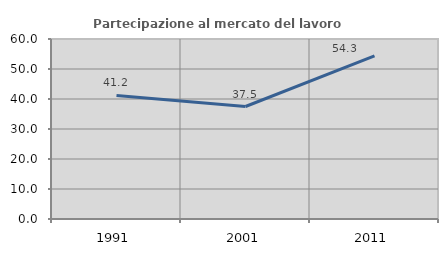
| Category | Partecipazione al mercato del lavoro  femminile |
|---|---|
| 1991.0 | 41.176 |
| 2001.0 | 37.5 |
| 2011.0 | 54.348 |